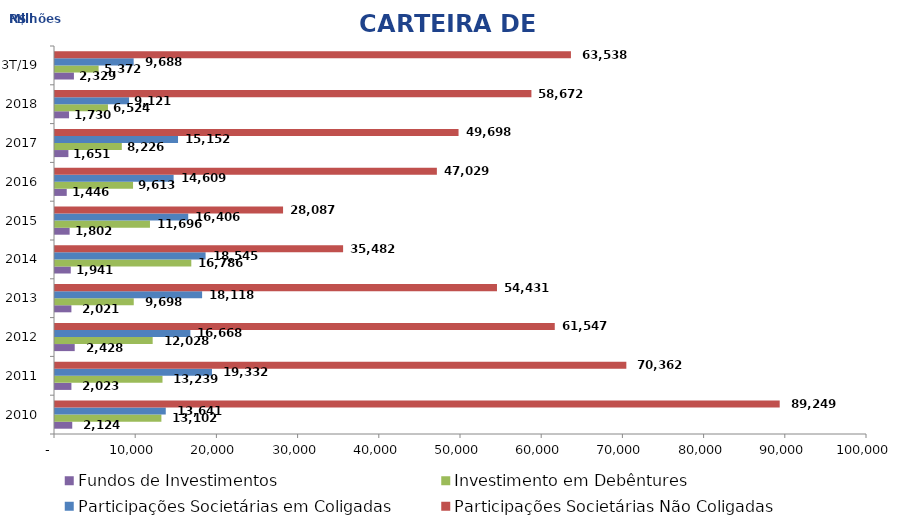
| Category | Fundos de Investimentos | Investimento em Debêntures | Participações Societárias em Coligadas | Participações Societárias Não Coligadas |
|---|---|---|---|---|
| 2010 | 2124.34 | 13102.437 | 13641.374 | 89249.116 |
| 2011 | 2022.829 | 13238.651 | 19332.192 | 70361.989 |
| 2012 | 2427.758 | 12027.608 | 16667.573 | 61547.222 |
| 2013 | 2021.134 | 9698.435 | 18118 | 54430.571 |
| 2014 | 1941.291 | 16786.333 | 18544.628 | 35481.7 |
| 2015 | 1802.472 | 11695.569 | 16405.548 | 28086.586 |
| 2016 | 1446.304 | 9612.662 | 14609.243 | 47028.593 |
| 2017 | 1651.337 | 8226.488 | 15152.49 | 49697.568 |
| 2018 | 1730.462 | 6523.554 | 9121.442 | 58671.648 |
| 3T/19 | 2329.205 | 5371.532 | 9687.582 | 63538.458 |